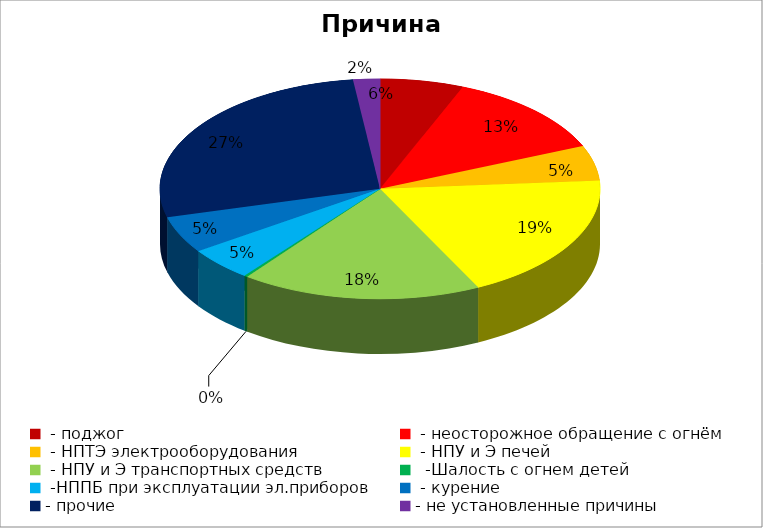
| Category | Причина пожара |
|---|---|
|  - поджог | 25 |
|  - неосторожное обращение с огнём | 51 |
|  - НПТЭ электрооборудования | 21 |
|  - НПУ и Э печей | 77 |
|  - НПУ и Э транспортных средств | 72 |
|   -Шалость с огнем детей | 1 |
|  -НППБ при эксплуатации эл.приборов | 20 |
|  - курение | 22 |
| - прочие | 111 |
| - не установленные причины | 8 |